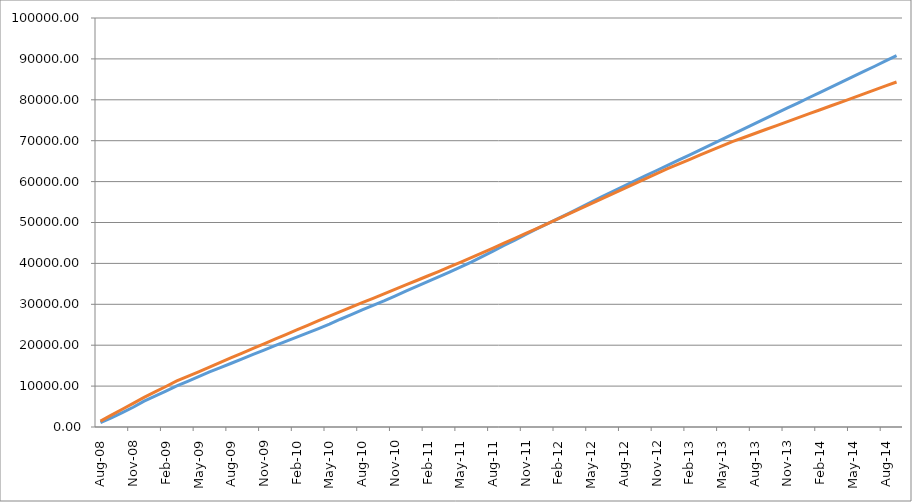
| Category | Series 0 | Series 1 |
|---|---|---|
| 2008-08-01 | 1085.131 | 1446.67 |
| 2008-09-01 | 2216.411 | 2893.34 |
| 2008-10-01 | 3504.707 | 4337.245 |
| 2008-11-01 | 4826.119 | 5781.149 |
| 2008-12-01 | 6314.893 | 7225.054 |
| 2009-01-01 | 7526.888 | 8567.189 |
| 2009-02-01 | 8789.645 | 9909.325 |
| 2009-03-01 | 10032.267 | 11251.46 |
| 2009-04-01 | 11175.965 | 12374.273 |
| 2009-05-01 | 12339.596 | 13497.086 |
| 2009-06-01 | 13478.879 | 14619.899 |
| 2009-07-01 | 14539.997 | 15775.991 |
| 2009-08-01 | 15591.267 | 16932.083 |
| 2009-09-01 | 16672.512 | 18088.174 |
| 2009-10-01 | 17753.575 | 19212.397 |
| 2009-11-01 | 18813.607 | 20336.621 |
| 2009-12-01 | 19877.529 | 21460.844 |
| 2010-01-01 | 20929.84 | 22595.986 |
| 2010-02-01 | 21960.81 | 23731.127 |
| 2010-03-01 | 22997.412 | 24866.269 |
| 2010-04-01 | 24045.241 | 25980.953 |
| 2010-05-01 | 25140.618 | 27095.638 |
| 2010-06-01 | 26344.54 | 28210.322 |
| 2010-07-01 | 27453.033 | 29297.783 |
| 2010-08-01 | 28620.893 | 30385.243 |
| 2010-09-01 | 29732.772 | 31472.704 |
| 2010-10-01 | 30828.692 | 32556.66 |
| 2010-11-01 | 31999.744 | 33640.616 |
| 2010-12-01 | 33203.408 | 34724.573 |
| 2011-01-01 | 34354.874 | 35821.321 |
| 2011-02-01 | 35522.757 | 36918.069 |
| 2011-03-01 | 36696.29 | 38014.817 |
| 2011-04-01 | 37860.116 | 39139.544 |
| 2011-05-01 | 39079.066 | 40264.27 |
| 2011-06-01 | 40315.784 | 41388.996 |
| 2011-07-01 | 41643.534 | 42572.704 |
| 2011-08-01 | 42993.618 | 43756.411 |
| 2011-09-01 | 44369.257 | 44940.118 |
| 2011-10-01 | 45711.877 | 46132.143 |
| 2011-11-01 | 47071.39 | 47324.168 |
| 2011-12-01 | 48433.024 | 48516.193 |
| 2012-01-01 | 49741.686 | 49735.56 |
| 2012-02-01 | 51018.341 | 50954.928 |
| 2012-03-01 | 52307.059 | 52174.295 |
| 2012-04-01 | 53613.595 | 53387.732 |
| 2012-05-01 | 54987.444 | 54601.169 |
| 2012-06-01 | 56310.761 | 55814.606 |
| 2012-07-01 | 57592.563 | 57050.503 |
| 2012-08-01 | 58896.135 | 58286.4 |
| 2012-09-01 | 60168.29 | 59522.298 |
| 2012-10-01 | 61445.848 | 60733.541 |
| 2012-11-01 | 62712.922 | 61944.785 |
| 2012-12-01 | 63972.683 | 63156.028 |
| 2013-01-01 | 65233.031 | 64277.234 |
| 2013-02-01 | 66494.16 | 65398.44 |
| 2013-03-01 | 67763.095 | 66519.645 |
| 2013-04-01 | 69028.745 | 67618.755 |
| 2013-05-01 | 70309.84 | 68717.865 |
| 2013-06-01 | 71617.322 | 69816.975 |
| 2013-07-01 | 72898.342 | 70789.177 |
| 2013-08-01 | 74190.677 | 71761.38 |
| 2013-09-01 | 75472.628 | 72733.582 |
| 2013-10-01 | 76735.71 | 73699.706 |
| 2013-11-01 | 78006.123 | 74665.83 |
| 2013-12-01 | 79269.801 | 75631.954 |
| 2014-01-01 | 80563.289 | 76602.094 |
| 2014-02-01 | 81837.425 | 77572.235 |
| 2014-03-01 | 83109.401 | 78542.376 |
| 2014-04-01 | 84390.72 | 79512.516 |
| 2014-05-01 | 85653.801 | 80482.657 |
| 2014-06-01 | 86928.346 | 81452.798 |
| 2014-07-01 | 88204.526 | 82419.975 |
| 2014-08-01 | 89501.561 | 83387.152 |
| 2014-09-01 | 90789.19 | 84354.329 |